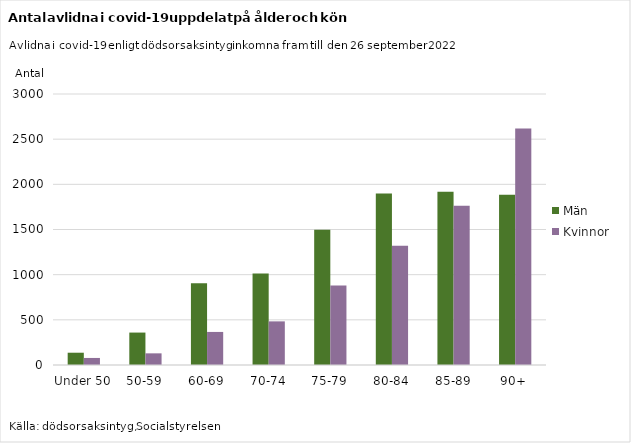
| Category | Män | Kvinnor |
|---|---|---|
| Under 50 | 136 | 78 |
| 50-59 | 359 | 129 |
| 60-69 | 904 | 366 |
| 70-74 | 1013 | 483 |
| 75-79 | 1496 | 879 |
| 80-84 | 1898 | 1320 |
| 85-89 | 1918 | 1764 |
| 90+ | 1884 | 2617 |